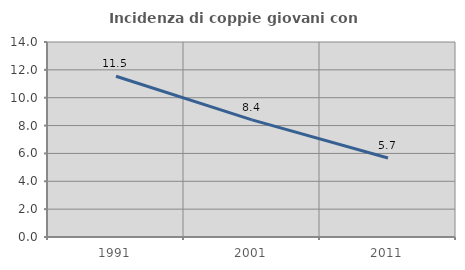
| Category | Incidenza di coppie giovani con figli |
|---|---|
| 1991.0 | 11.538 |
| 2001.0 | 8.408 |
| 2011.0 | 5.674 |